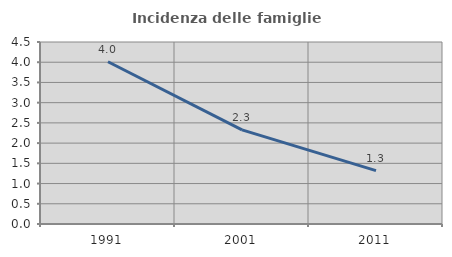
| Category | Incidenza delle famiglie numerose |
|---|---|
| 1991.0 | 4.011 |
| 2001.0 | 2.327 |
| 2011.0 | 1.321 |